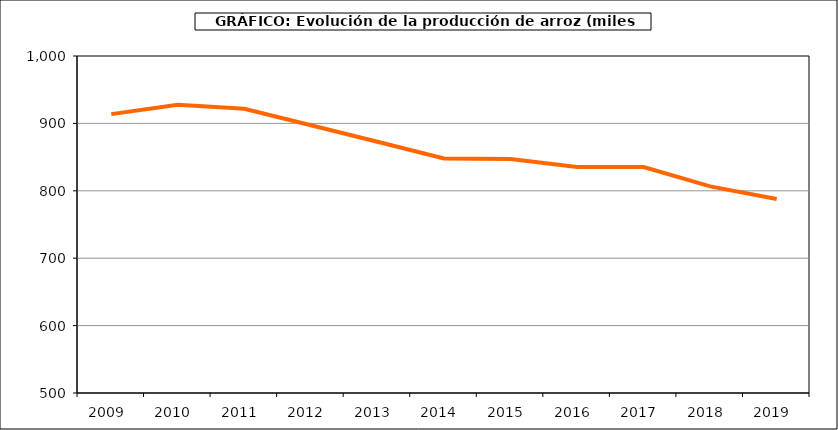
| Category | Superficie |
|---|---|
| 2009.0 | 913.754 |
| 2010.0 | 927.817 |
| 2011.0 | 921.738 |
| 2012.0 | 897.318 |
| 2013.0 | 872.689 |
| 2014.0 | 847.976 |
| 2015.0 | 847.026 |
| 2016.0 | 835.2 |
| 2017.0 | 835.178 |
| 2018.0 | 806.589 |
| 2019.0 | 787.832 |